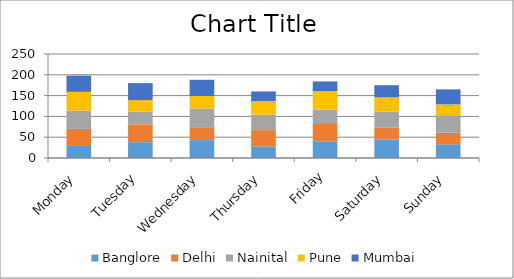
| Category | Banglore | Delhi | Nainital | Pune | Mumbai |
|---|---|---|---|---|---|
| Monday | 31 | 39 | 44 | 45 | 39 |
| Tuesday | 38 | 43 | 31 | 27 | 41 |
| Wednesday | 43 | 31 | 45 | 30 | 39 |
| Thursday | 28 | 39 | 37 | 33 | 23 |
| Friday | 39 | 45 | 32 | 45 | 23 |
| Saturday | 44 | 29 | 39 | 34 | 29 |
| Sunday | 33 | 28 | 42 | 26 | 36 |